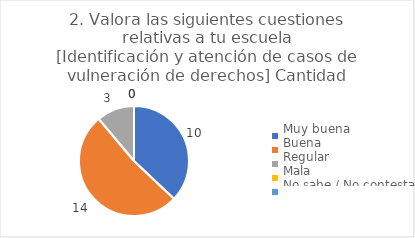
| Category | 2. Valora las siguientes cuestiones relativas a tu escuela
[Identificación y atención de casos de vulneración de derechos] |
|---|---|
| Muy buena  | 0.37 |
| Buena  | 0.519 |
| Regular  | 0.111 |
| Mala  | 0 |
| No sabe / No contesta | 0 |